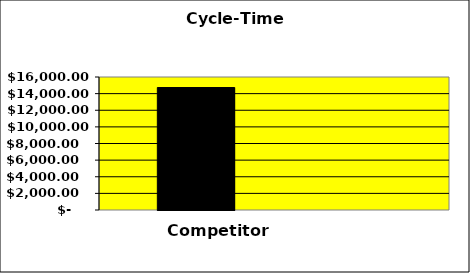
| Category | Series 0 | Series 1 | Series 2 |
|---|---|---|---|
| 0 | 14733.333 |  | 0 |